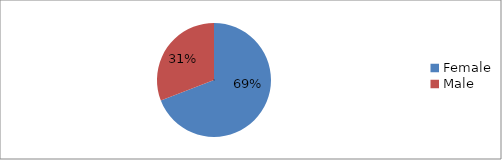
| Category | Series 1 |
|---|---|
| Female | 168 |
| Male | 75 |